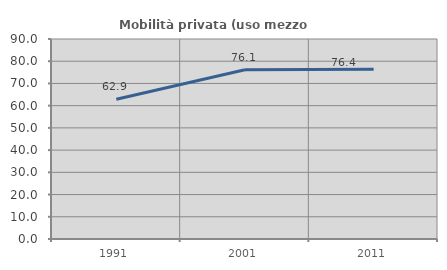
| Category | Mobilità privata (uso mezzo privato) |
|---|---|
| 1991.0 | 62.887 |
| 2001.0 | 76.136 |
| 2011.0 | 76.361 |